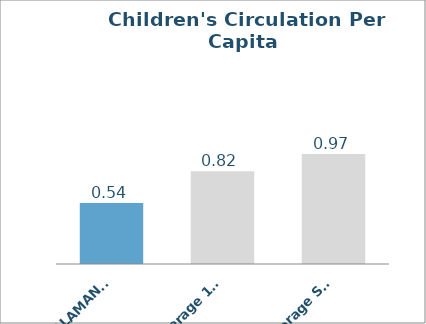
| Category | Physical |
|---|---|
| ALAMANCE | 0.538 |
| Average 100,000-249,999 population | 0.819 |
| Average Statewide | 0.97 |